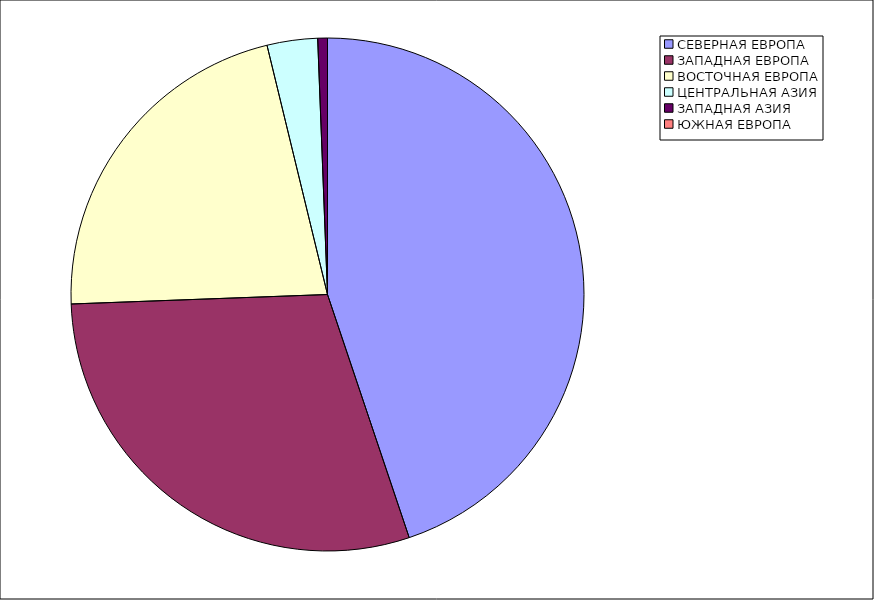
| Category | Оборот |
|---|---|
| СЕВЕРНАЯ ЕВРОПА | 44.84 |
| ЗАПАДНАЯ ЕВРОПА | 29.57 |
| ВОСТОЧНАЯ ЕВРОПА | 21.8 |
| ЦЕНТРАЛЬНАЯ АЗИЯ | 3.18 |
| ЗАПАДНАЯ АЗИЯ | 0.61 |
| ЮЖНАЯ ЕВРОПА | 0 |